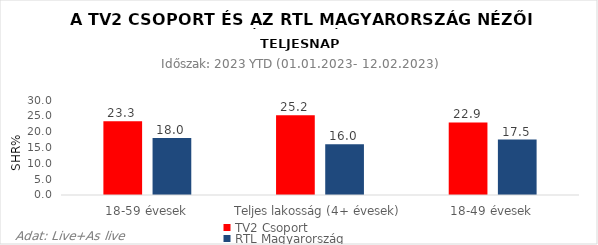
| Category | TV2 Csoport | RTL Magyarország |
|---|---|---|
| 18-59 évesek | 23.3 | 18 |
| Teljes lakosság (4+ évesek) | 25.2 | 16 |
| 18-49 évesek | 22.9 | 17.5 |